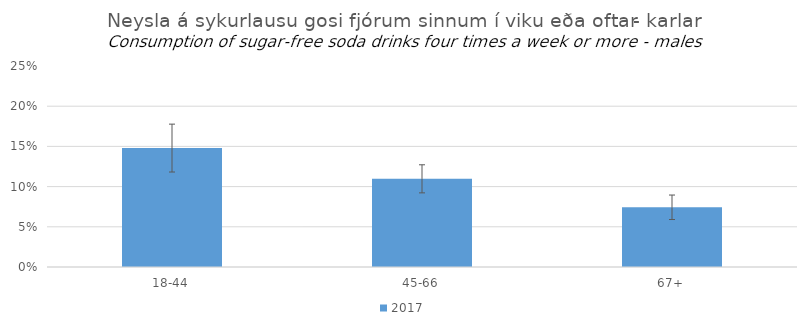
| Category | 2017 |
|---|---|
| 18-44 | 0.148 |
| 45-66 | 0.11 |
| 67+ | 0.074 |